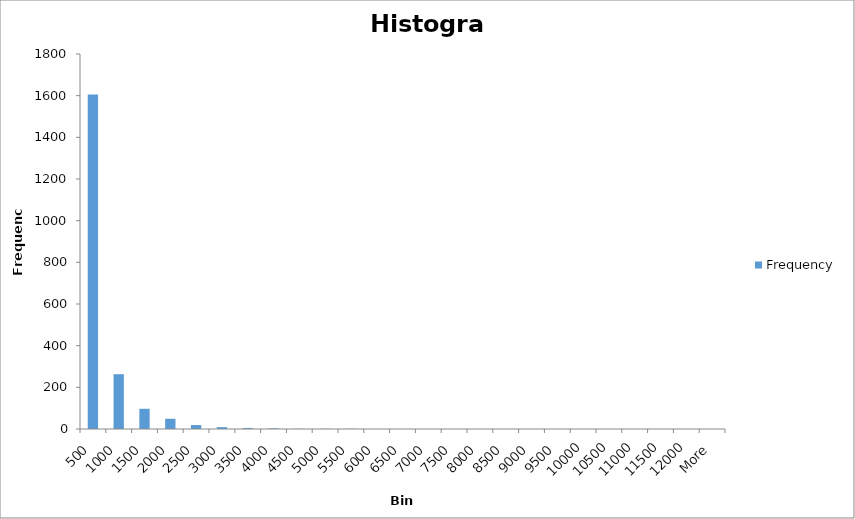
| Category | Frequency |
|---|---|
| 500 | 1606 |
| 1000 | 263 |
| 1500 | 97 |
| 2000 | 49 |
| 2500 | 19 |
| 3000 | 9 |
| 3500 | 5 |
| 4000 | 3 |
| 4500 | 1 |
| 5000 | 1 |
| 5500 | 1 |
| 6000 | 0 |
| 6500 | 0 |
| 7000 | 0 |
| 7500 | 0 |
| 8000 | 0 |
| 8500 | 0 |
| 9000 | 0 |
| 9500 | 0 |
| 10000 | 0 |
| 10500 | 0 |
| 11000 | 0 |
| 11500 | 0 |
| 12000 | 0 |
| More | 0 |